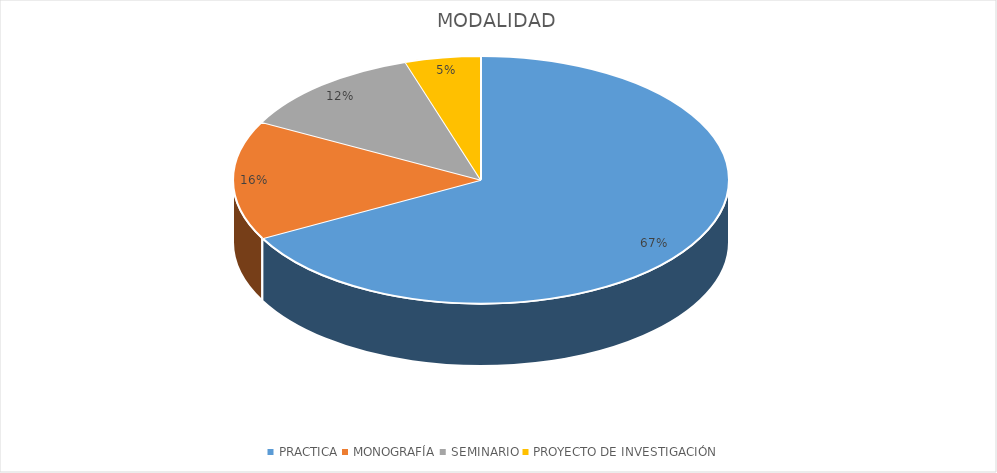
| Category | Series 0 |
|---|---|
| PRACTICA | 354 |
| MONOGRAFÍA | 82 |
| SEMINARIO | 65 |
| PROYECTO DE INVESTIGACIÓN | 26 |